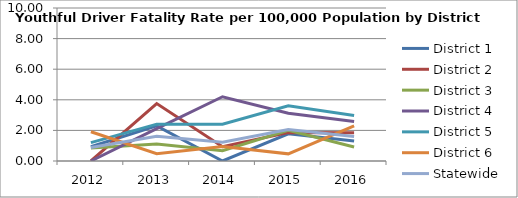
| Category | District 1 | District 2 | District 3 | District 4 | District 5 | District 6 | Statewide |
|---|---|---|---|---|---|---|---|
| 2012.0 | 0.928 | 0 | 0.845 | 0 | 1.199 | 1.909 | 0.877 |
| 2013.0 | 2.298 | 3.753 | 1.107 | 2.118 | 2.408 | 0.475 | 1.613 |
| 2014.0 | 0 | 0.934 | 0.678 | 4.2 | 2.406 | 0.942 | 1.224 |
| 2015.0 | 1.778 | 1.862 | 2.001 | 3.119 | 3.605 | 0.467 | 2.054 |
| 2016.0 | 1.304 | 1.851 | 0.915 | 2.578 | 2.98 | 2.291 | 1.604 |